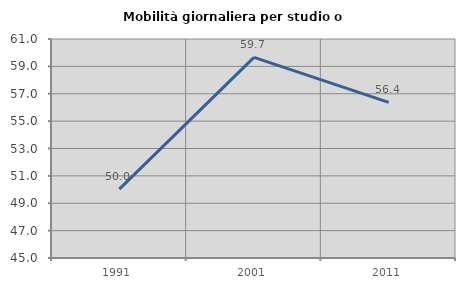
| Category | Mobilità giornaliera per studio o lavoro |
|---|---|
| 1991.0 | 50.034 |
| 2001.0 | 59.655 |
| 2011.0 | 56.366 |